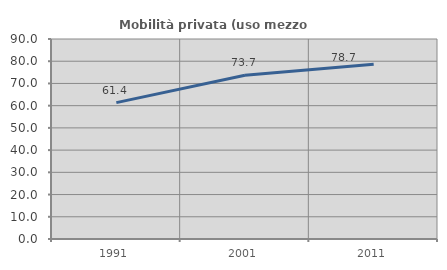
| Category | Mobilità privata (uso mezzo privato) |
|---|---|
| 1991.0 | 61.364 |
| 2001.0 | 73.701 |
| 2011.0 | 78.674 |